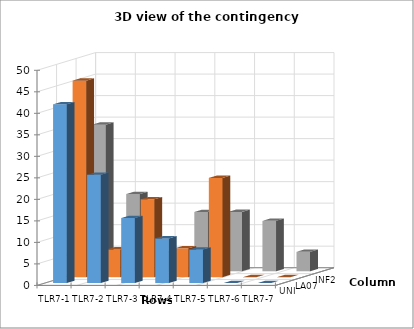
| Category | UNI | LA07 | INF2 |
|---|---|---|---|
| TLR7-1 | 41.542 | 45.683 | 34.073 |
| TLR7-2 | 25.155 | 6.442 | 17.943 |
| TLR7-3 | 15.112 | 18.097 | 4.168 |
| TLR7-4 | 10.386 | 6.709 | 13.775 |
| TLR7-5 | 7.805 | 23.069 | 13.802 |
| TLR7-6 | 0 | 0 | 11.719 |
| TLR7-7 | 0 | 0 | 4.52 |